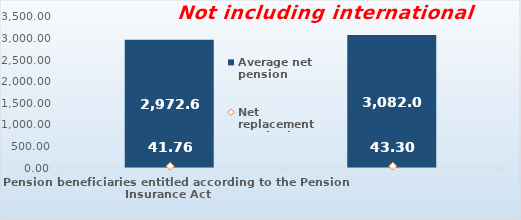
| Category | Average net pension  |
|---|---|
| Pension beneficiaries entitled according to the Pension Insurance Act   | 2972.64 |
| Pension beneficiaries entitled to pension FOR THE FIRST TIME in 2021 according to the Pension Insurance Act  - NEW BENEFICIARIES | 3082.054 |